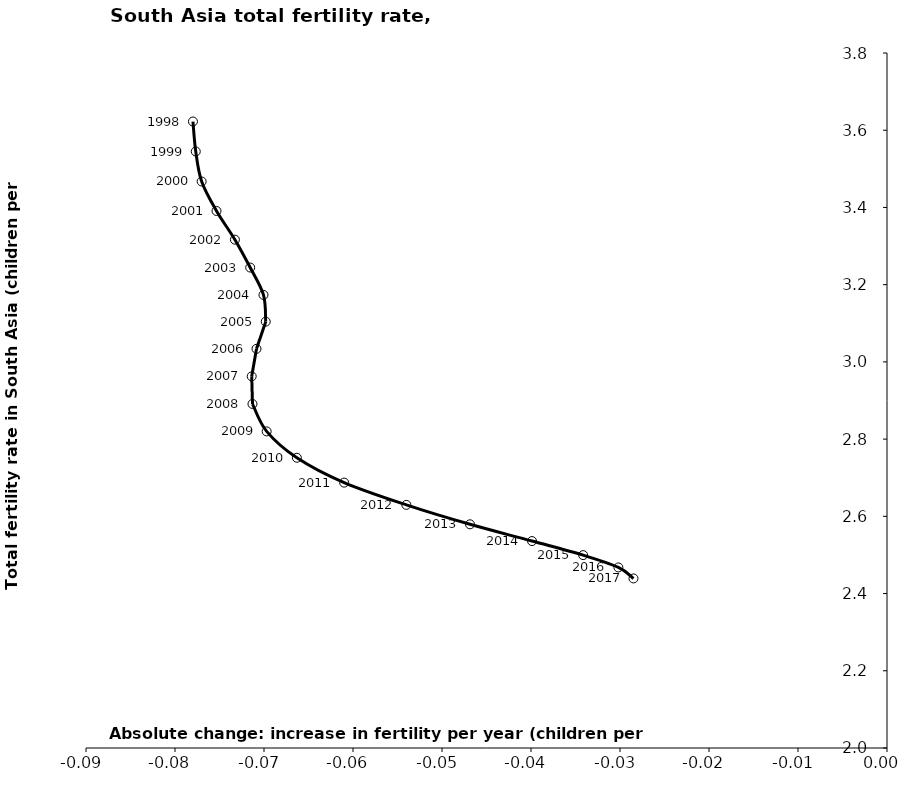
| Category | Series 0 |
|---|---|
| -0.07798272790129013 | 3.623 |
| -0.07766748881823804 | 3.545 |
| -0.07700483733627617 | 3.467 |
| -0.07533547813716801 | 3.391 |
| -0.07326719572586171 | 3.317 |
| -0.07155143945171893 | 3.244 |
| -0.07005807108390294 | 3.173 |
| -0.06980511006524082 | 3.104 |
| -0.07084261443891204 | 3.034 |
| -0.07138158907525893 | 2.963 |
| -0.07129465990074668 | 2.891 |
| -0.06970075905825368 | 2.82 |
| -0.06630719131917773 | 2.752 |
| -0.060995409941162704 | 2.687 |
| -0.054006067696611426 | 2.63 |
| -0.04685335588399697 | 2.579 |
| -0.039885693206493045 | 2.536 |
| -0.03414317373863196 | 2.5 |
| -0.030181203576091775 | 2.468 |
| -0.028482574274679262 | 2.439 |